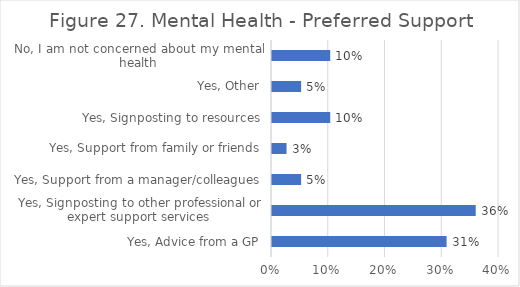
| Category | Series 0 |
|---|---|
| Yes, Advice from a GP | 0.308 |
| Yes, Signposting to other professional or expert support services  | 0.359 |
| Yes, Support from a manager/colleagues | 0.051 |
| Yes, Support from family or friends | 0.026 |
| Yes, Signposting to resources | 0.103 |
| Yes, Other | 0.051 |
| No, I am not concerned about my mental health | 0.103 |